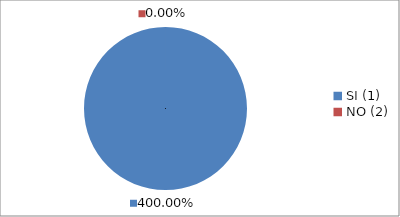
| Category | Series 0 |
|---|---|
| SI (1) | 4 |
| NO (2) | 0 |